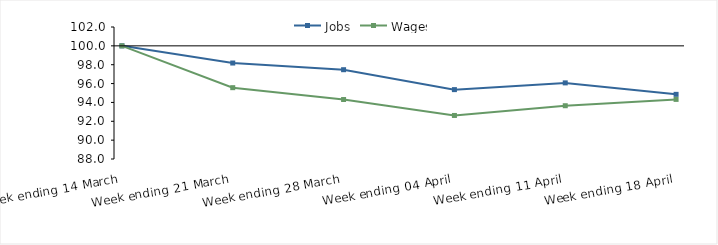
| Category | Jobs | Wages |
|---|---|---|
| 0 | 100 | 100 |
| 1900-01-01 | 98.179 | 95.565 |
| 1900-01-02 | 97.471 | 94.308 |
| 1900-01-03 | 95.358 | 92.618 |
| 1900-01-04 | 96.073 | 93.65 |
| 1900-01-05 | 94.857 | 94.323 |